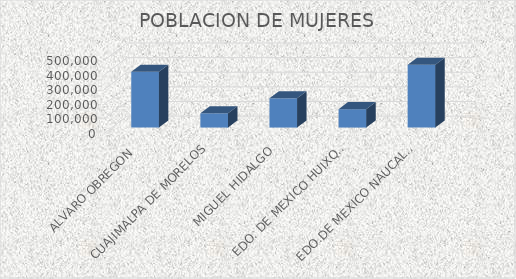
| Category | POBLACION DE MUJERES |
|---|---|
| ALVARO OBREGON | 380993 |
| CUAJIMALPA DE MORELOS | 97749 |
| MIGUEL HIDALGO | 200222 |
| EDO. DE MEXICO HUIXQUILUCAN | 125665 |
| EDO.DE MEXICO NAUCALPAN DE JUAREZ | 428805 |